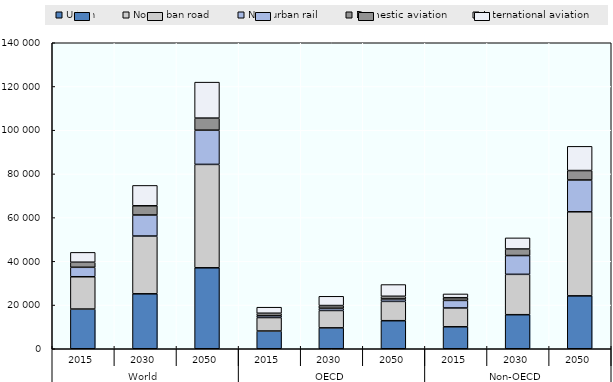
| Category | Urban | Non-urban road | Non-urban rail | Domestic aviation | International aviation |
|---|---|---|---|---|---|
| 0 | 18163.911 | 14778.103 | 4325.506 | 2327.475 | 4500.126 |
| 1 | 25139.507 | 26425.848 | 9632.532 | 4211.054 | 9321.677 |
| 2 | 37040.189 | 47306.039 | 15656.93 | 5524.697 | 16452.014 |
| 3 | 8117.138 | 6166.063 | 862.827 | 1098.267 | 2767.193 |
| 4 | 9560.381 | 7956.444 | 1032.938 | 1212.047 | 4242.65 |
| 5 | 12835.257 | 8846.306 | 1103.55 | 1218.561 | 5370.468 |
| 6 | 10046.773 | 8612.04 | 3462.679 | 1229.208 | 1732.933 |
| 7 | 15579.127 | 18469.405 | 8599.594 | 2999.007 | 5079.028 |
| 8 | 24204.932 | 38459.733 | 14553.38 | 4306.136 | 11081.547 |